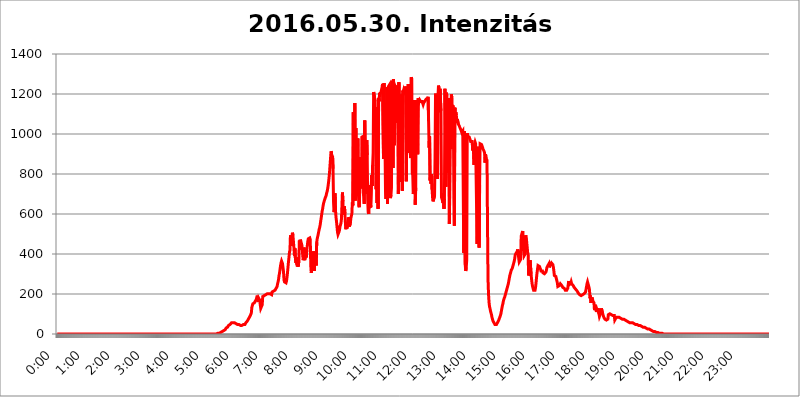
| Category | 2016.05.30. Intenzitás [W/m^2] |
|---|---|
| 0.0 | 0 |
| 0.0006944444444444445 | 0 |
| 0.001388888888888889 | 0 |
| 0.0020833333333333333 | 0 |
| 0.002777777777777778 | 0 |
| 0.003472222222222222 | 0 |
| 0.004166666666666667 | 0 |
| 0.004861111111111111 | 0 |
| 0.005555555555555556 | 0 |
| 0.0062499999999999995 | 0 |
| 0.006944444444444444 | 0 |
| 0.007638888888888889 | 0 |
| 0.008333333333333333 | 0 |
| 0.009027777777777779 | 0 |
| 0.009722222222222222 | 0 |
| 0.010416666666666666 | 0 |
| 0.011111111111111112 | 0 |
| 0.011805555555555555 | 0 |
| 0.012499999999999999 | 0 |
| 0.013194444444444444 | 0 |
| 0.013888888888888888 | 0 |
| 0.014583333333333332 | 0 |
| 0.015277777777777777 | 0 |
| 0.015972222222222224 | 0 |
| 0.016666666666666666 | 0 |
| 0.017361111111111112 | 0 |
| 0.018055555555555557 | 0 |
| 0.01875 | 0 |
| 0.019444444444444445 | 0 |
| 0.02013888888888889 | 0 |
| 0.020833333333333332 | 0 |
| 0.02152777777777778 | 0 |
| 0.022222222222222223 | 0 |
| 0.02291666666666667 | 0 |
| 0.02361111111111111 | 0 |
| 0.024305555555555556 | 0 |
| 0.024999999999999998 | 0 |
| 0.025694444444444447 | 0 |
| 0.02638888888888889 | 0 |
| 0.027083333333333334 | 0 |
| 0.027777777777777776 | 0 |
| 0.02847222222222222 | 0 |
| 0.029166666666666664 | 0 |
| 0.029861111111111113 | 0 |
| 0.030555555555555555 | 0 |
| 0.03125 | 0 |
| 0.03194444444444445 | 0 |
| 0.03263888888888889 | 0 |
| 0.03333333333333333 | 0 |
| 0.034027777777777775 | 0 |
| 0.034722222222222224 | 0 |
| 0.035416666666666666 | 0 |
| 0.036111111111111115 | 0 |
| 0.03680555555555556 | 0 |
| 0.0375 | 0 |
| 0.03819444444444444 | 0 |
| 0.03888888888888889 | 0 |
| 0.03958333333333333 | 0 |
| 0.04027777777777778 | 0 |
| 0.04097222222222222 | 0 |
| 0.041666666666666664 | 0 |
| 0.042361111111111106 | 0 |
| 0.04305555555555556 | 0 |
| 0.043750000000000004 | 0 |
| 0.044444444444444446 | 0 |
| 0.04513888888888889 | 0 |
| 0.04583333333333334 | 0 |
| 0.04652777777777778 | 0 |
| 0.04722222222222222 | 0 |
| 0.04791666666666666 | 0 |
| 0.04861111111111111 | 0 |
| 0.049305555555555554 | 0 |
| 0.049999999999999996 | 0 |
| 0.05069444444444445 | 0 |
| 0.051388888888888894 | 0 |
| 0.052083333333333336 | 0 |
| 0.05277777777777778 | 0 |
| 0.05347222222222222 | 0 |
| 0.05416666666666667 | 0 |
| 0.05486111111111111 | 0 |
| 0.05555555555555555 | 0 |
| 0.05625 | 0 |
| 0.05694444444444444 | 0 |
| 0.057638888888888885 | 0 |
| 0.05833333333333333 | 0 |
| 0.05902777777777778 | 0 |
| 0.059722222222222225 | 0 |
| 0.06041666666666667 | 0 |
| 0.061111111111111116 | 0 |
| 0.06180555555555556 | 0 |
| 0.0625 | 0 |
| 0.06319444444444444 | 0 |
| 0.06388888888888888 | 0 |
| 0.06458333333333334 | 0 |
| 0.06527777777777778 | 0 |
| 0.06597222222222222 | 0 |
| 0.06666666666666667 | 0 |
| 0.06736111111111111 | 0 |
| 0.06805555555555555 | 0 |
| 0.06874999999999999 | 0 |
| 0.06944444444444443 | 0 |
| 0.07013888888888889 | 0 |
| 0.07083333333333333 | 0 |
| 0.07152777777777779 | 0 |
| 0.07222222222222223 | 0 |
| 0.07291666666666667 | 0 |
| 0.07361111111111111 | 0 |
| 0.07430555555555556 | 0 |
| 0.075 | 0 |
| 0.07569444444444444 | 0 |
| 0.0763888888888889 | 0 |
| 0.07708333333333334 | 0 |
| 0.07777777777777778 | 0 |
| 0.07847222222222222 | 0 |
| 0.07916666666666666 | 0 |
| 0.0798611111111111 | 0 |
| 0.08055555555555556 | 0 |
| 0.08125 | 0 |
| 0.08194444444444444 | 0 |
| 0.08263888888888889 | 0 |
| 0.08333333333333333 | 0 |
| 0.08402777777777777 | 0 |
| 0.08472222222222221 | 0 |
| 0.08541666666666665 | 0 |
| 0.08611111111111112 | 0 |
| 0.08680555555555557 | 0 |
| 0.08750000000000001 | 0 |
| 0.08819444444444445 | 0 |
| 0.08888888888888889 | 0 |
| 0.08958333333333333 | 0 |
| 0.09027777777777778 | 0 |
| 0.09097222222222222 | 0 |
| 0.09166666666666667 | 0 |
| 0.09236111111111112 | 0 |
| 0.09305555555555556 | 0 |
| 0.09375 | 0 |
| 0.09444444444444444 | 0 |
| 0.09513888888888888 | 0 |
| 0.09583333333333333 | 0 |
| 0.09652777777777777 | 0 |
| 0.09722222222222222 | 0 |
| 0.09791666666666667 | 0 |
| 0.09861111111111111 | 0 |
| 0.09930555555555555 | 0 |
| 0.09999999999999999 | 0 |
| 0.10069444444444443 | 0 |
| 0.1013888888888889 | 0 |
| 0.10208333333333335 | 0 |
| 0.10277777777777779 | 0 |
| 0.10347222222222223 | 0 |
| 0.10416666666666667 | 0 |
| 0.10486111111111111 | 0 |
| 0.10555555555555556 | 0 |
| 0.10625 | 0 |
| 0.10694444444444444 | 0 |
| 0.1076388888888889 | 0 |
| 0.10833333333333334 | 0 |
| 0.10902777777777778 | 0 |
| 0.10972222222222222 | 0 |
| 0.1111111111111111 | 0 |
| 0.11180555555555556 | 0 |
| 0.11180555555555556 | 0 |
| 0.1125 | 0 |
| 0.11319444444444444 | 0 |
| 0.11388888888888889 | 0 |
| 0.11458333333333333 | 0 |
| 0.11527777777777777 | 0 |
| 0.11597222222222221 | 0 |
| 0.11666666666666665 | 0 |
| 0.1173611111111111 | 0 |
| 0.11805555555555557 | 0 |
| 0.11944444444444445 | 0 |
| 0.12013888888888889 | 0 |
| 0.12083333333333333 | 0 |
| 0.12152777777777778 | 0 |
| 0.12222222222222223 | 0 |
| 0.12291666666666667 | 0 |
| 0.12291666666666667 | 0 |
| 0.12361111111111112 | 0 |
| 0.12430555555555556 | 0 |
| 0.125 | 0 |
| 0.12569444444444444 | 0 |
| 0.12638888888888888 | 0 |
| 0.12708333333333333 | 0 |
| 0.16875 | 0 |
| 0.12847222222222224 | 0 |
| 0.12916666666666668 | 0 |
| 0.12986111111111112 | 0 |
| 0.13055555555555556 | 0 |
| 0.13125 | 0 |
| 0.13194444444444445 | 0 |
| 0.1326388888888889 | 0 |
| 0.13333333333333333 | 0 |
| 0.13402777777777777 | 0 |
| 0.13402777777777777 | 0 |
| 0.13472222222222222 | 0 |
| 0.13541666666666666 | 0 |
| 0.1361111111111111 | 0 |
| 0.13749999999999998 | 0 |
| 0.13819444444444443 | 0 |
| 0.1388888888888889 | 0 |
| 0.13958333333333334 | 0 |
| 0.14027777777777778 | 0 |
| 0.14097222222222222 | 0 |
| 0.14166666666666666 | 0 |
| 0.1423611111111111 | 0 |
| 0.14305555555555557 | 0 |
| 0.14375000000000002 | 0 |
| 0.14444444444444446 | 0 |
| 0.1451388888888889 | 0 |
| 0.1451388888888889 | 0 |
| 0.14652777777777778 | 0 |
| 0.14722222222222223 | 0 |
| 0.14791666666666667 | 0 |
| 0.1486111111111111 | 0 |
| 0.14930555555555555 | 0 |
| 0.15 | 0 |
| 0.15069444444444444 | 0 |
| 0.15138888888888888 | 0 |
| 0.15208333333333332 | 0 |
| 0.15277777777777776 | 0 |
| 0.15347222222222223 | 0 |
| 0.15416666666666667 | 0 |
| 0.15486111111111112 | 0 |
| 0.15555555555555556 | 0 |
| 0.15625 | 0 |
| 0.15694444444444444 | 0 |
| 0.15763888888888888 | 0 |
| 0.15833333333333333 | 0 |
| 0.15902777777777777 | 0 |
| 0.15972222222222224 | 0 |
| 0.16041666666666668 | 0 |
| 0.16111111111111112 | 0 |
| 0.16180555555555556 | 0 |
| 0.1625 | 0 |
| 0.16319444444444445 | 0 |
| 0.1638888888888889 | 0 |
| 0.16458333333333333 | 0 |
| 0.16527777777777777 | 0 |
| 0.16597222222222222 | 0 |
| 0.16666666666666666 | 0 |
| 0.1673611111111111 | 0 |
| 0.16805555555555554 | 0 |
| 0.16874999999999998 | 0 |
| 0.16944444444444443 | 0 |
| 0.17013888888888887 | 0 |
| 0.1708333333333333 | 0 |
| 0.17152777777777775 | 0 |
| 0.17222222222222225 | 0 |
| 0.1729166666666667 | 0 |
| 0.17361111111111113 | 0 |
| 0.17430555555555557 | 0 |
| 0.17500000000000002 | 0 |
| 0.17569444444444446 | 0 |
| 0.1763888888888889 | 0 |
| 0.17708333333333334 | 0 |
| 0.17777777777777778 | 0 |
| 0.17847222222222223 | 0 |
| 0.17916666666666667 | 0 |
| 0.1798611111111111 | 0 |
| 0.18055555555555555 | 0 |
| 0.18125 | 0 |
| 0.18194444444444444 | 0 |
| 0.1826388888888889 | 0 |
| 0.18333333333333335 | 0 |
| 0.1840277777777778 | 0 |
| 0.18472222222222223 | 0 |
| 0.18541666666666667 | 0 |
| 0.18611111111111112 | 0 |
| 0.18680555555555556 | 0 |
| 0.1875 | 0 |
| 0.18819444444444444 | 0 |
| 0.18888888888888888 | 0 |
| 0.18958333333333333 | 0 |
| 0.19027777777777777 | 0 |
| 0.1909722222222222 | 0 |
| 0.19166666666666665 | 0 |
| 0.19236111111111112 | 0 |
| 0.19305555555555554 | 0 |
| 0.19375 | 0 |
| 0.19444444444444445 | 0 |
| 0.1951388888888889 | 0 |
| 0.19583333333333333 | 0 |
| 0.19652777777777777 | 0 |
| 0.19722222222222222 | 0 |
| 0.19791666666666666 | 0 |
| 0.1986111111111111 | 0 |
| 0.19930555555555554 | 0 |
| 0.19999999999999998 | 0 |
| 0.20069444444444443 | 0 |
| 0.20138888888888887 | 0 |
| 0.2020833333333333 | 0 |
| 0.2027777777777778 | 0 |
| 0.2034722222222222 | 0 |
| 0.2041666666666667 | 0 |
| 0.20486111111111113 | 0 |
| 0.20555555555555557 | 0 |
| 0.20625000000000002 | 0 |
| 0.20694444444444446 | 0 |
| 0.2076388888888889 | 0 |
| 0.20833333333333334 | 0 |
| 0.20902777777777778 | 0 |
| 0.20972222222222223 | 0 |
| 0.21041666666666667 | 0 |
| 0.2111111111111111 | 0 |
| 0.21180555555555555 | 0 |
| 0.2125 | 0 |
| 0.21319444444444444 | 0 |
| 0.2138888888888889 | 0 |
| 0.21458333333333335 | 0 |
| 0.2152777777777778 | 0 |
| 0.21597222222222223 | 0 |
| 0.21666666666666667 | 0 |
| 0.21736111111111112 | 0 |
| 0.21805555555555556 | 0 |
| 0.21875 | 0 |
| 0.21944444444444444 | 0 |
| 0.22013888888888888 | 0 |
| 0.22083333333333333 | 0 |
| 0.22152777777777777 | 0 |
| 0.2222222222222222 | 0 |
| 0.22291666666666665 | 0 |
| 0.2236111111111111 | 0 |
| 0.22430555555555556 | 0 |
| 0.225 | 3.525 |
| 0.22569444444444445 | 3.525 |
| 0.2263888888888889 | 3.525 |
| 0.22708333333333333 | 3.525 |
| 0.22777777777777777 | 3.525 |
| 0.22847222222222222 | 7.887 |
| 0.22916666666666666 | 7.887 |
| 0.2298611111111111 | 12.257 |
| 0.23055555555555554 | 12.257 |
| 0.23124999999999998 | 12.257 |
| 0.23194444444444443 | 12.257 |
| 0.23263888888888887 | 12.257 |
| 0.2333333333333333 | 16.636 |
| 0.2340277777777778 | 16.636 |
| 0.2347222222222222 | 21.024 |
| 0.2354166666666667 | 21.024 |
| 0.23611111111111113 | 25.419 |
| 0.23680555555555557 | 29.823 |
| 0.23750000000000002 | 29.823 |
| 0.23819444444444446 | 34.234 |
| 0.2388888888888889 | 34.234 |
| 0.23958333333333334 | 38.653 |
| 0.24027777777777778 | 43.079 |
| 0.24097222222222223 | 43.079 |
| 0.24166666666666667 | 47.511 |
| 0.2423611111111111 | 47.511 |
| 0.24305555555555555 | 51.951 |
| 0.24375 | 51.951 |
| 0.24444444444444446 | 56.398 |
| 0.24513888888888888 | 56.398 |
| 0.24583333333333335 | 56.398 |
| 0.2465277777777778 | 56.398 |
| 0.24722222222222223 | 56.398 |
| 0.24791666666666667 | 56.398 |
| 0.24861111111111112 | 56.398 |
| 0.24930555555555556 | 56.398 |
| 0.25 | 51.951 |
| 0.25069444444444444 | 51.951 |
| 0.2513888888888889 | 51.951 |
| 0.2520833333333333 | 51.951 |
| 0.25277777777777777 | 47.511 |
| 0.2534722222222222 | 47.511 |
| 0.25416666666666665 | 47.511 |
| 0.2548611111111111 | 47.511 |
| 0.2555555555555556 | 47.511 |
| 0.25625000000000003 | 47.511 |
| 0.2569444444444445 | 43.079 |
| 0.2576388888888889 | 43.079 |
| 0.25833333333333336 | 43.079 |
| 0.2590277777777778 | 43.079 |
| 0.25972222222222224 | 43.079 |
| 0.2604166666666667 | 43.079 |
| 0.2611111111111111 | 47.511 |
| 0.26180555555555557 | 47.511 |
| 0.2625 | 47.511 |
| 0.26319444444444445 | 47.511 |
| 0.2638888888888889 | 51.951 |
| 0.26458333333333334 | 56.398 |
| 0.2652777777777778 | 60.85 |
| 0.2659722222222222 | 60.85 |
| 0.26666666666666666 | 65.31 |
| 0.2673611111111111 | 69.775 |
| 0.26805555555555555 | 74.246 |
| 0.26875 | 78.722 |
| 0.26944444444444443 | 83.205 |
| 0.2701388888888889 | 87.692 |
| 0.2708333333333333 | 92.184 |
| 0.27152777777777776 | 96.682 |
| 0.2722222222222222 | 105.69 |
| 0.27291666666666664 | 132.814 |
| 0.2736111111111111 | 128.284 |
| 0.2743055555555555 | 150.964 |
| 0.27499999999999997 | 146.423 |
| 0.27569444444444446 | 155.509 |
| 0.27638888888888885 | 155.509 |
| 0.27708333333333335 | 160.056 |
| 0.2777777777777778 | 164.605 |
| 0.27847222222222223 | 169.156 |
| 0.2791666666666667 | 173.709 |
| 0.2798611111111111 | 182.82 |
| 0.28055555555555556 | 191.937 |
| 0.28125 | 191.937 |
| 0.28194444444444444 | 160.056 |
| 0.2826388888888889 | 178.264 |
| 0.2833333333333333 | 178.264 |
| 0.28402777777777777 | 169.156 |
| 0.2847222222222222 | 146.423 |
| 0.28541666666666665 | 128.284 |
| 0.28611111111111115 | 128.284 |
| 0.28680555555555554 | 132.814 |
| 0.28750000000000003 | 146.423 |
| 0.2881944444444445 | 187.378 |
| 0.2888888888888889 | 187.378 |
| 0.28958333333333336 | 191.937 |
| 0.2902777777777778 | 191.937 |
| 0.29097222222222224 | 196.497 |
| 0.2916666666666667 | 196.497 |
| 0.2923611111111111 | 196.497 |
| 0.29305555555555557 | 201.058 |
| 0.29375 | 201.058 |
| 0.29444444444444445 | 201.058 |
| 0.2951388888888889 | 201.058 |
| 0.29583333333333334 | 201.058 |
| 0.2965277777777778 | 201.058 |
| 0.2972222222222222 | 201.058 |
| 0.29791666666666666 | 201.058 |
| 0.2986111111111111 | 201.058 |
| 0.29930555555555555 | 205.62 |
| 0.3 | 205.62 |
| 0.30069444444444443 | 196.497 |
| 0.3013888888888889 | 210.182 |
| 0.3020833333333333 | 214.746 |
| 0.30277777777777776 | 214.746 |
| 0.3034722222222222 | 214.746 |
| 0.30416666666666664 | 219.309 |
| 0.3048611111111111 | 219.309 |
| 0.3055555555555555 | 219.309 |
| 0.30624999999999997 | 223.873 |
| 0.3069444444444444 | 228.436 |
| 0.3076388888888889 | 233 |
| 0.30833333333333335 | 237.564 |
| 0.3090277777777778 | 251.251 |
| 0.30972222222222223 | 260.373 |
| 0.3104166666666667 | 274.047 |
| 0.3111111111111111 | 292.259 |
| 0.31180555555555556 | 305.898 |
| 0.3125 | 324.052 |
| 0.31319444444444444 | 342.162 |
| 0.3138888888888889 | 355.712 |
| 0.3145833333333333 | 364.728 |
| 0.31527777777777777 | 360.221 |
| 0.3159722222222222 | 351.198 |
| 0.31666666666666665 | 346.682 |
| 0.31736111111111115 | 310.44 |
| 0.31805555555555554 | 269.49 |
| 0.31875000000000003 | 260.373 |
| 0.3194444444444445 | 264.932 |
| 0.3201388888888889 | 255.813 |
| 0.32083333333333336 | 255.813 |
| 0.3215277777777778 | 264.932 |
| 0.32222222222222224 | 283.156 |
| 0.3229166666666667 | 305.898 |
| 0.3236111111111111 | 333.113 |
| 0.32430555555555557 | 360.221 |
| 0.325 | 382.715 |
| 0.32569444444444445 | 409.574 |
| 0.3263888888888889 | 418.492 |
| 0.32708333333333334 | 493.475 |
| 0.3277777777777778 | 462.786 |
| 0.3284722222222222 | 440.702 |
| 0.32916666666666666 | 480.356 |
| 0.3298611111111111 | 506.542 |
| 0.33055555555555555 | 493.475 |
| 0.33125 | 489.108 |
| 0.33194444444444443 | 431.833 |
| 0.3326388888888889 | 391.685 |
| 0.3333333333333333 | 427.39 |
| 0.3340277777777778 | 378.224 |
| 0.3347222222222222 | 355.712 |
| 0.3354166666666667 | 382.715 |
| 0.3361111111111111 | 346.682 |
| 0.3368055555555556 | 337.639 |
| 0.33749999999999997 | 360.221 |
| 0.33819444444444446 | 337.639 |
| 0.33888888888888885 | 373.729 |
| 0.33958333333333335 | 467.187 |
| 0.34027777777777773 | 422.943 |
| 0.34097222222222223 | 471.582 |
| 0.3416666666666666 | 462.786 |
| 0.3423611111111111 | 453.968 |
| 0.3430555555555555 | 445.129 |
| 0.34375 | 440.702 |
| 0.3444444444444445 | 387.202 |
| 0.3451388888888889 | 369.23 |
| 0.3458333333333334 | 431.833 |
| 0.34652777777777777 | 422.943 |
| 0.34722222222222227 | 369.23 |
| 0.34791666666666665 | 414.035 |
| 0.34861111111111115 | 409.574 |
| 0.34930555555555554 | 382.715 |
| 0.35000000000000003 | 422.943 |
| 0.3506944444444444 | 440.702 |
| 0.3513888888888889 | 462.786 |
| 0.3520833333333333 | 475.972 |
| 0.3527777777777778 | 480.356 |
| 0.3534722222222222 | 480.356 |
| 0.3541666666666667 | 480.356 |
| 0.3548611111111111 | 471.582 |
| 0.35555555555555557 | 342.162 |
| 0.35625 | 305.898 |
| 0.35694444444444445 | 301.354 |
| 0.3576388888888889 | 337.639 |
| 0.35833333333333334 | 373.729 |
| 0.3590277777777778 | 382.715 |
| 0.3597222222222222 | 414.035 |
| 0.36041666666666666 | 314.98 |
| 0.3611111111111111 | 310.44 |
| 0.36180555555555555 | 396.164 |
| 0.3625 | 387.202 |
| 0.36319444444444443 | 342.162 |
| 0.3638888888888889 | 458.38 |
| 0.3645833333333333 | 475.972 |
| 0.3652777777777778 | 480.356 |
| 0.3659722222222222 | 497.836 |
| 0.3666666666666667 | 510.885 |
| 0.3673611111111111 | 523.88 |
| 0.3680555555555556 | 532.513 |
| 0.36874999999999997 | 545.416 |
| 0.36944444444444446 | 562.53 |
| 0.37013888888888885 | 579.542 |
| 0.37083333333333335 | 596.45 |
| 0.37152777777777773 | 613.252 |
| 0.37222222222222223 | 625.784 |
| 0.3729166666666666 | 642.4 |
| 0.3736111111111111 | 654.791 |
| 0.3743055555555555 | 663.019 |
| 0.375 | 671.22 |
| 0.3756944444444445 | 679.395 |
| 0.3763888888888889 | 683.473 |
| 0.3770833333333334 | 691.608 |
| 0.37777777777777777 | 703.762 |
| 0.37847222222222227 | 711.832 |
| 0.37916666666666665 | 723.889 |
| 0.37986111111111115 | 739.877 |
| 0.38055555555555554 | 759.723 |
| 0.38125000000000003 | 783.342 |
| 0.3819444444444444 | 810.641 |
| 0.3826388888888889 | 845.365 |
| 0.3833333333333333 | 879.719 |
| 0.3840277777777778 | 913.766 |
| 0.3847222222222222 | 906.223 |
| 0.3854166666666667 | 864.493 |
| 0.3861111111111111 | 891.099 |
| 0.38680555555555557 | 826.123 |
| 0.3875 | 658.909 |
| 0.38819444444444445 | 609.062 |
| 0.3888888888888889 | 625.784 |
| 0.38958333333333334 | 703.762 |
| 0.3902777777777778 | 617.436 |
| 0.3909722222222222 | 583.779 |
| 0.39166666666666666 | 562.53 |
| 0.3923611111111111 | 536.82 |
| 0.39305555555555555 | 510.885 |
| 0.39375 | 497.836 |
| 0.39444444444444443 | 497.836 |
| 0.3951388888888889 | 510.885 |
| 0.3958333333333333 | 519.555 |
| 0.3965277777777778 | 536.82 |
| 0.3972222222222222 | 545.416 |
| 0.3979166666666667 | 553.986 |
| 0.3986111111111111 | 575.299 |
| 0.3993055555555556 | 642.4 |
| 0.39999999999999997 | 707.8 |
| 0.40069444444444446 | 663.019 |
| 0.40138888888888885 | 596.45 |
| 0.40208333333333335 | 596.45 |
| 0.40277777777777773 | 638.256 |
| 0.40347222222222223 | 604.864 |
| 0.4041666666666666 | 553.986 |
| 0.4048611111111111 | 523.88 |
| 0.4055555555555555 | 558.261 |
| 0.40625 | 528.2 |
| 0.4069444444444445 | 545.416 |
| 0.4076388888888889 | 566.793 |
| 0.4083333333333334 | 566.793 |
| 0.40902777777777777 | 583.779 |
| 0.40972222222222227 | 536.82 |
| 0.41041666666666665 | 541.121 |
| 0.41111111111111115 | 553.986 |
| 0.41180555555555554 | 579.542 |
| 0.41250000000000003 | 583.779 |
| 0.4131944444444444 | 600.661 |
| 0.4138888888888889 | 658.909 |
| 0.4145833333333333 | 642.4 |
| 0.4152777777777778 | 1108.816 |
| 0.4159722222222222 | 675.311 |
| 0.4166666666666667 | 787.258 |
| 0.4173611111111111 | 1154.814 |
| 0.41805555555555557 | 667.123 |
| 0.41875 | 1029.798 |
| 0.41944444444444445 | 723.889 |
| 0.4201388888888889 | 735.89 |
| 0.42083333333333334 | 695.666 |
| 0.4215277777777778 | 977.508 |
| 0.4222222222222222 | 731.896 |
| 0.42291666666666666 | 642.4 |
| 0.4236111111111111 | 634.105 |
| 0.42430555555555555 | 731.896 |
| 0.425 | 883.516 |
| 0.42569444444444443 | 759.723 |
| 0.4263888888888889 | 751.803 |
| 0.4270833333333333 | 727.896 |
| 0.4277777777777778 | 988.714 |
| 0.4284722222222222 | 759.723 |
| 0.4291666666666667 | 992.448 |
| 0.4298611111111111 | 691.608 |
| 0.4305555555555556 | 650.667 |
| 0.43124999999999997 | 1067.267 |
| 0.43194444444444446 | 891.099 |
| 0.43263888888888885 | 767.62 |
| 0.43333333333333335 | 699.717 |
| 0.43402777777777773 | 970.034 |
| 0.43472222222222223 | 894.885 |
| 0.4354166666666666 | 671.22 |
| 0.4361111111111111 | 609.062 |
| 0.4368055555555555 | 600.661 |
| 0.4375 | 667.123 |
| 0.4381944444444445 | 629.948 |
| 0.4388888888888889 | 743.859 |
| 0.4395833333333334 | 634.105 |
| 0.44027777777777777 | 638.256 |
| 0.44097222222222227 | 795.074 |
| 0.44166666666666665 | 739.877 |
| 0.44236111111111115 | 845.365 |
| 0.44305555555555554 | 906.223 |
| 0.44375000000000003 | 1209.807 |
| 0.4444444444444444 | 1205.82 |
| 0.4451388888888889 | 1209.807 |
| 0.4458333333333333 | 1162.571 |
| 0.4465277777777778 | 970.034 |
| 0.4472222222222222 | 723.889 |
| 0.4479166666666667 | 906.223 |
| 0.4486111111111111 | 654.791 |
| 0.44930555555555557 | 1135.543 |
| 0.45 | 625.784 |
| 0.45069444444444445 | 1178.177 |
| 0.4513888888888889 | 1162.571 |
| 0.45208333333333334 | 1201.843 |
| 0.4527777777777778 | 1201.843 |
| 0.4534722222222222 | 1201.843 |
| 0.45416666666666666 | 1209.807 |
| 0.4548611111111111 | 1213.804 |
| 0.45555555555555555 | 1233.951 |
| 0.45625 | 1250.275 |
| 0.45694444444444443 | 1254.387 |
| 0.4576388888888889 | 875.918 |
| 0.4583333333333333 | 1254.387 |
| 0.4590277777777778 | 1108.816 |
| 0.4597222222222222 | 932.576 |
| 0.4604166666666667 | 711.832 |
| 0.4611111111111111 | 675.311 |
| 0.4618055555555556 | 1067.267 |
| 0.46249999999999997 | 1233.951 |
| 0.46319444444444446 | 650.667 |
| 0.46388888888888885 | 1229.899 |
| 0.46458333333333335 | 1238.014 |
| 0.46527777777777773 | 1233.951 |
| 0.46597222222222223 | 1246.176 |
| 0.4666666666666666 | 1242.089 |
| 0.4673611111111111 | 679.395 |
| 0.4680555555555555 | 695.666 |
| 0.46875 | 731.896 |
| 0.4694444444444445 | 1229.899 |
| 0.4701388888888889 | 1266.8 |
| 0.4708333333333334 | 829.981 |
| 0.47152777777777777 | 1275.142 |
| 0.47222222222222227 | 1229.899 |
| 0.47291666666666665 | 943.832 |
| 0.47361111111111115 | 1242.089 |
| 0.47430555555555554 | 1246.176 |
| 0.47500000000000003 | 1242.089 |
| 0.4756944444444444 | 1229.899 |
| 0.4763888888888889 | 1056.004 |
| 0.4770833333333333 | 1059.756 |
| 0.4777777777777778 | 1242.089 |
| 0.4784722222222222 | 699.717 |
| 0.4791666666666667 | 1258.511 |
| 0.4798611111111111 | 868.305 |
| 0.48055555555555557 | 759.723 |
| 0.48125 | 981.244 |
| 0.48194444444444445 | 1147.086 |
| 0.4826388888888889 | 1131.708 |
| 0.48333333333333334 | 1197.876 |
| 0.4840277777777778 | 715.858 |
| 0.4847222222222222 | 1217.812 |
| 0.48541666666666666 | 1209.807 |
| 0.4861111111111111 | 1221.83 |
| 0.48680555555555555 | 1217.812 |
| 0.4875 | 1209.807 |
| 0.48819444444444443 | 1217.812 |
| 0.4888888888888889 | 1238.014 |
| 0.4895833333333333 | 763.674 |
| 0.4902777777777778 | 1089.873 |
| 0.4909722222222222 | 1233.951 |
| 0.4916666666666667 | 906.223 |
| 0.4923611111111111 | 1250.275 |
| 0.4930555555555556 | 932.576 |
| 0.49374999999999997 | 1250.275 |
| 0.49444444444444446 | 1063.51 |
| 0.49513888888888885 | 902.447 |
| 0.49583333333333335 | 879.719 |
| 0.49652777777777773 | 1283.541 |
| 0.49722222222222223 | 1275.142 |
| 0.4979166666666666 | 802.868 |
| 0.4986111111111111 | 795.074 |
| 0.4993055555555555 | 699.717 |
| 0.5 | 711.832 |
| 0.5006944444444444 | 1170.358 |
| 0.5013888888888889 | 951.327 |
| 0.5020833333333333 | 646.537 |
| 0.5027777777777778 | 731.896 |
| 0.5034722222222222 | 1170.358 |
| 0.5041666666666667 | 932.576 |
| 0.5048611111111111 | 1147.086 |
| 0.5055555555555555 | 898.668 |
| 0.50625 | 1178.177 |
| 0.5069444444444444 | 1174.263 |
| 0.5076388888888889 | 1162.571 |
| 0.5083333333333333 | 1170.358 |
| 0.5090277777777777 | 1166.46 |
| 0.5097222222222222 | 1162.571 |
| 0.5104166666666666 | 1162.571 |
| 0.5111111111111112 | 1162.571 |
| 0.5118055555555555 | 1162.571 |
| 0.5125000000000001 | 1154.814 |
| 0.5131944444444444 | 1147.086 |
| 0.513888888888889 | 1154.814 |
| 0.5145833333333333 | 1154.814 |
| 0.5152777777777778 | 1154.814 |
| 0.5159722222222222 | 1166.46 |
| 0.5166666666666667 | 1170.358 |
| 0.517361111111111 | 1174.263 |
| 0.5180555555555556 | 1170.358 |
| 0.5187499999999999 | 1174.263 |
| 0.5194444444444445 | 1178.177 |
| 0.5201388888888888 | 1186.03 |
| 0.5208333333333334 | 1063.51 |
| 0.5215277777777778 | 932.576 |
| 0.5222222222222223 | 988.714 |
| 0.5229166666666667 | 767.62 |
| 0.5236111111111111 | 795.074 |
| 0.5243055555555556 | 751.803 |
| 0.525 | 798.974 |
| 0.5256944444444445 | 723.889 |
| 0.5263888888888889 | 683.473 |
| 0.5270833333333333 | 663.019 |
| 0.5277777777777778 | 663.019 |
| 0.5284722222222222 | 667.123 |
| 0.5291666666666667 | 691.608 |
| 0.5298611111111111 | 875.918 |
| 0.5305555555555556 | 1201.843 |
| 0.53125 | 962.555 |
| 0.5319444444444444 | 1108.816 |
| 0.5326388888888889 | 860.676 |
| 0.5333333333333333 | 775.492 |
| 0.5340277777777778 | 1189.969 |
| 0.5347222222222222 | 1242.089 |
| 0.5354166666666667 | 1229.899 |
| 0.5361111111111111 | 1108.816 |
| 0.5368055555555555 | 1225.859 |
| 0.5375 | 1229.899 |
| 0.5381944444444444 | 1116.426 |
| 0.5388888888888889 | 683.473 |
| 0.5395833333333333 | 687.544 |
| 0.5402777777777777 | 667.123 |
| 0.5409722222222222 | 654.791 |
| 0.5416666666666666 | 703.762 |
| 0.5423611111111112 | 625.784 |
| 0.5430555555555555 | 675.311 |
| 0.5437500000000001 | 1225.859 |
| 0.5444444444444444 | 1041.019 |
| 0.545138888888889 | 735.89 |
| 0.5458333333333333 | 1205.82 |
| 0.5465277777777778 | 1189.969 |
| 0.5472222222222222 | 806.757 |
| 0.5479166666666667 | 1105.019 |
| 0.548611111111111 | 1059.756 |
| 0.5493055555555556 | 1178.177 |
| 0.5499999999999999 | 549.704 |
| 0.5506944444444445 | 545.416 |
| 0.5513888888888888 | 1178.177 |
| 0.5520833333333334 | 925.06 |
| 0.5527777777777778 | 1197.876 |
| 0.5534722222222223 | 1182.099 |
| 0.5541666666666667 | 1116.426 |
| 0.5548611111111111 | 1143.232 |
| 0.5555555555555556 | 1112.618 |
| 0.55625 | 695.666 |
| 0.5569444444444445 | 541.121 |
| 0.5576388888888889 | 1131.708 |
| 0.5583333333333333 | 1093.653 |
| 0.5590277777777778 | 1108.816 |
| 0.5597222222222222 | 1093.653 |
| 0.5604166666666667 | 1056.004 |
| 0.5611111111111111 | 1074.789 |
| 0.5618055555555556 | 1071.027 |
| 0.5625 | 1048.508 |
| 0.5631944444444444 | 1052.255 |
| 0.5638888888888889 | 1041.019 |
| 0.5645833333333333 | 1033.537 |
| 0.5652777777777778 | 1029.798 |
| 0.5659722222222222 | 1022.323 |
| 0.5666666666666667 | 1014.852 |
| 0.5673611111111111 | 1007.383 |
| 0.5680555555555555 | 1007.383 |
| 0.56875 | 1014.852 |
| 0.5694444444444444 | 1018.587 |
| 0.5701388888888889 | 405.108 |
| 0.5708333333333333 | 1014.852 |
| 0.5715277777777777 | 1014.852 |
| 0.5722222222222222 | 346.682 |
| 0.5729166666666666 | 314.98 |
| 0.5736111111111112 | 333.113 |
| 0.5743055555555555 | 369.23 |
| 0.5750000000000001 | 1003.65 |
| 0.5756944444444444 | 988.714 |
| 0.576388888888889 | 992.448 |
| 0.5770833333333333 | 988.714 |
| 0.5777777777777778 | 984.98 |
| 0.5784722222222222 | 977.508 |
| 0.5791666666666667 | 970.034 |
| 0.579861111111111 | 962.555 |
| 0.5805555555555556 | 958.814 |
| 0.5812499999999999 | 958.814 |
| 0.5819444444444445 | 962.555 |
| 0.5826388888888888 | 917.534 |
| 0.5833333333333334 | 951.327 |
| 0.5840277777777778 | 955.071 |
| 0.5847222222222223 | 845.365 |
| 0.5854166666666667 | 947.58 |
| 0.5861111111111111 | 958.814 |
| 0.5868055555555556 | 951.327 |
| 0.5875 | 955.071 |
| 0.5881944444444445 | 947.58 |
| 0.5888888888888889 | 449.551 |
| 0.5895833333333333 | 936.33 |
| 0.5902777777777778 | 932.576 |
| 0.5909722222222222 | 818.392 |
| 0.5916666666666667 | 431.833 |
| 0.5923611111111111 | 743.859 |
| 0.5930555555555556 | 951.327 |
| 0.59375 | 955.071 |
| 0.5944444444444444 | 947.58 |
| 0.5951388888888889 | 947.58 |
| 0.5958333333333333 | 947.58 |
| 0.5965277777777778 | 932.576 |
| 0.5972222222222222 | 925.06 |
| 0.5979166666666667 | 921.298 |
| 0.5986111111111111 | 913.766 |
| 0.5993055555555555 | 906.223 |
| 0.6 | 856.855 |
| 0.6006944444444444 | 898.668 |
| 0.6013888888888889 | 879.719 |
| 0.6020833333333333 | 875.918 |
| 0.6027777777777777 | 868.305 |
| 0.6034722222222222 | 541.121 |
| 0.6041666666666666 | 274.047 |
| 0.6048611111111112 | 201.058 |
| 0.6055555555555555 | 160.056 |
| 0.6062500000000001 | 137.347 |
| 0.6069444444444444 | 128.284 |
| 0.607638888888889 | 114.716 |
| 0.6083333333333333 | 105.69 |
| 0.6090277777777778 | 96.682 |
| 0.6097222222222222 | 83.205 |
| 0.6104166666666667 | 74.246 |
| 0.611111111111111 | 65.31 |
| 0.6118055555555556 | 60.85 |
| 0.6124999999999999 | 56.398 |
| 0.6131944444444445 | 51.951 |
| 0.6138888888888888 | 47.511 |
| 0.6145833333333334 | 47.511 |
| 0.6152777777777778 | 43.079 |
| 0.6159722222222223 | 47.511 |
| 0.6166666666666667 | 51.951 |
| 0.6173611111111111 | 56.398 |
| 0.6180555555555556 | 56.398 |
| 0.61875 | 65.31 |
| 0.6194444444444445 | 69.775 |
| 0.6201388888888889 | 78.722 |
| 0.6208333333333333 | 83.205 |
| 0.6215277777777778 | 92.184 |
| 0.6222222222222222 | 101.184 |
| 0.6229166666666667 | 114.716 |
| 0.6236111111111111 | 128.284 |
| 0.6243055555555556 | 141.884 |
| 0.625 | 150.964 |
| 0.6256944444444444 | 164.605 |
| 0.6263888888888889 | 173.709 |
| 0.6270833333333333 | 178.264 |
| 0.6277777777777778 | 187.378 |
| 0.6284722222222222 | 196.497 |
| 0.6291666666666667 | 205.62 |
| 0.6298611111111111 | 214.746 |
| 0.6305555555555555 | 223.873 |
| 0.63125 | 233 |
| 0.6319444444444444 | 242.127 |
| 0.6326388888888889 | 251.251 |
| 0.6333333333333333 | 264.932 |
| 0.6340277777777777 | 278.603 |
| 0.6347222222222222 | 292.259 |
| 0.6354166666666666 | 301.354 |
| 0.6361111111111112 | 310.44 |
| 0.6368055555555555 | 319.517 |
| 0.6375000000000001 | 324.052 |
| 0.6381944444444444 | 328.584 |
| 0.638888888888889 | 337.639 |
| 0.6395833333333333 | 346.682 |
| 0.6402777777777778 | 355.712 |
| 0.6409722222222222 | 364.728 |
| 0.6416666666666667 | 378.224 |
| 0.642361111111111 | 396.164 |
| 0.6430555555555556 | 400.638 |
| 0.6437499999999999 | 405.108 |
| 0.6444444444444445 | 405.108 |
| 0.6451388888888888 | 414.035 |
| 0.6458333333333334 | 422.943 |
| 0.6465277777777778 | 405.108 |
| 0.6472222222222223 | 378.224 |
| 0.6479166666666667 | 360.221 |
| 0.6486111111111111 | 364.728 |
| 0.6493055555555556 | 355.712 |
| 0.65 | 373.729 |
| 0.6506944444444445 | 489.108 |
| 0.6513888888888889 | 493.475 |
| 0.6520833333333333 | 506.542 |
| 0.6527777777777778 | 515.223 |
| 0.6534722222222222 | 422.943 |
| 0.6541666666666667 | 414.035 |
| 0.6548611111111111 | 391.685 |
| 0.6555555555555556 | 387.202 |
| 0.65625 | 400.638 |
| 0.6569444444444444 | 493.475 |
| 0.6576388888888889 | 489.108 |
| 0.6583333333333333 | 462.786 |
| 0.6590277777777778 | 436.27 |
| 0.6597222222222222 | 409.574 |
| 0.6604166666666667 | 396.164 |
| 0.6611111111111111 | 292.259 |
| 0.6618055555555555 | 296.808 |
| 0.6625 | 314.98 |
| 0.6631944444444444 | 369.23 |
| 0.6638888888888889 | 369.23 |
| 0.6645833333333333 | 296.808 |
| 0.6652777777777777 | 274.047 |
| 0.6659722222222222 | 251.251 |
| 0.6666666666666666 | 237.564 |
| 0.6673611111111111 | 228.436 |
| 0.6680555555555556 | 219.309 |
| 0.6687500000000001 | 214.746 |
| 0.6694444444444444 | 214.746 |
| 0.6701388888888888 | 219.309 |
| 0.6708333333333334 | 233 |
| 0.6715277777777778 | 255.813 |
| 0.6722222222222222 | 283.156 |
| 0.6729166666666666 | 305.898 |
| 0.6736111111111112 | 324.052 |
| 0.6743055555555556 | 342.162 |
| 0.6749999999999999 | 342.162 |
| 0.6756944444444444 | 342.162 |
| 0.6763888888888889 | 337.639 |
| 0.6770833333333334 | 333.113 |
| 0.6777777777777777 | 324.052 |
| 0.6784722222222223 | 314.98 |
| 0.6791666666666667 | 314.98 |
| 0.6798611111111111 | 314.98 |
| 0.6805555555555555 | 314.98 |
| 0.68125 | 305.898 |
| 0.6819444444444445 | 301.354 |
| 0.6826388888888889 | 301.354 |
| 0.6833333333333332 | 301.354 |
| 0.6840277777777778 | 301.354 |
| 0.6847222222222222 | 305.898 |
| 0.6854166666666667 | 310.44 |
| 0.686111111111111 | 319.517 |
| 0.6868055555555556 | 333.113 |
| 0.6875 | 337.639 |
| 0.6881944444444444 | 342.162 |
| 0.688888888888889 | 346.682 |
| 0.6895833333333333 | 351.198 |
| 0.6902777777777778 | 333.113 |
| 0.6909722222222222 | 342.162 |
| 0.6916666666666668 | 346.682 |
| 0.6923611111111111 | 346.682 |
| 0.6930555555555555 | 355.712 |
| 0.69375 | 355.712 |
| 0.6944444444444445 | 355.712 |
| 0.6951388888888889 | 346.682 |
| 0.6958333333333333 | 333.113 |
| 0.6965277777777777 | 314.98 |
| 0.6972222222222223 | 292.259 |
| 0.6979166666666666 | 287.709 |
| 0.6986111111111111 | 287.709 |
| 0.6993055555555556 | 287.709 |
| 0.7000000000000001 | 292.259 |
| 0.7006944444444444 | 287.709 |
| 0.7013888888888888 | 255.813 |
| 0.7020833333333334 | 237.564 |
| 0.7027777777777778 | 233 |
| 0.7034722222222222 | 237.564 |
| 0.7041666666666666 | 242.127 |
| 0.7048611111111112 | 246.689 |
| 0.7055555555555556 | 251.251 |
| 0.7062499999999999 | 251.251 |
| 0.7069444444444444 | 246.689 |
| 0.7076388888888889 | 242.127 |
| 0.7083333333333334 | 237.564 |
| 0.7090277777777777 | 233 |
| 0.7097222222222223 | 233 |
| 0.7104166666666667 | 228.436 |
| 0.7111111111111111 | 228.436 |
| 0.7118055555555555 | 223.873 |
| 0.7125 | 219.309 |
| 0.7131944444444445 | 219.309 |
| 0.7138888888888889 | 219.309 |
| 0.7145833333333332 | 219.309 |
| 0.7152777777777778 | 223.873 |
| 0.7159722222222222 | 228.436 |
| 0.7166666666666667 | 233 |
| 0.717361111111111 | 264.932 |
| 0.7180555555555556 | 246.689 |
| 0.71875 | 251.251 |
| 0.7194444444444444 | 246.689 |
| 0.720138888888889 | 251.251 |
| 0.7208333333333333 | 260.373 |
| 0.7215277777777778 | 251.251 |
| 0.7222222222222222 | 251.251 |
| 0.7229166666666668 | 246.689 |
| 0.7236111111111111 | 242.127 |
| 0.7243055555555555 | 237.564 |
| 0.725 | 233 |
| 0.7256944444444445 | 233 |
| 0.7263888888888889 | 228.436 |
| 0.7270833333333333 | 223.873 |
| 0.7277777777777777 | 223.873 |
| 0.7284722222222223 | 219.309 |
| 0.7291666666666666 | 214.746 |
| 0.7298611111111111 | 210.182 |
| 0.7305555555555556 | 205.62 |
| 0.7312500000000001 | 201.058 |
| 0.7319444444444444 | 201.058 |
| 0.7326388888888888 | 196.497 |
| 0.7333333333333334 | 191.937 |
| 0.7340277777777778 | 191.937 |
| 0.7347222222222222 | 191.937 |
| 0.7354166666666666 | 191.937 |
| 0.7361111111111112 | 196.497 |
| 0.7368055555555556 | 196.497 |
| 0.7374999999999999 | 196.497 |
| 0.7381944444444444 | 201.058 |
| 0.7388888888888889 | 201.058 |
| 0.7395833333333334 | 205.62 |
| 0.7402777777777777 | 205.62 |
| 0.7409722222222223 | 210.182 |
| 0.7416666666666667 | 210.182 |
| 0.7423611111111111 | 210.182 |
| 0.7430555555555555 | 251.251 |
| 0.74375 | 260.373 |
| 0.7444444444444445 | 255.813 |
| 0.7451388888888889 | 242.127 |
| 0.7458333333333332 | 233 |
| 0.7465277777777778 | 219.309 |
| 0.7472222222222222 | 178.264 |
| 0.7479166666666667 | 191.937 |
| 0.748611111111111 | 155.509 |
| 0.7493055555555556 | 169.156 |
| 0.75 | 182.82 |
| 0.7506944444444444 | 173.709 |
| 0.751388888888889 | 164.605 |
| 0.7520833333333333 | 164.605 |
| 0.7527777777777778 | 155.509 |
| 0.7534722222222222 | 119.235 |
| 0.7541666666666668 | 146.423 |
| 0.7548611111111111 | 146.423 |
| 0.7555555555555555 | 123.758 |
| 0.75625 | 110.201 |
| 0.7569444444444445 | 119.235 |
| 0.7576388888888889 | 110.201 |
| 0.7583333333333333 | 128.284 |
| 0.7590277777777777 | 128.284 |
| 0.7597222222222223 | 101.184 |
| 0.7604166666666666 | 87.692 |
| 0.7611111111111111 | 92.184 |
| 0.7618055555555556 | 101.184 |
| 0.7625000000000001 | 105.69 |
| 0.7631944444444444 | 128.284 |
| 0.7638888888888888 | 123.758 |
| 0.7645833333333334 | 128.284 |
| 0.7652777777777778 | 96.682 |
| 0.7659722222222222 | 92.184 |
| 0.7666666666666666 | 83.205 |
| 0.7673611111111112 | 78.722 |
| 0.7680555555555556 | 74.246 |
| 0.7687499999999999 | 69.775 |
| 0.7694444444444444 | 69.775 |
| 0.7701388888888889 | 69.775 |
| 0.7708333333333334 | 69.775 |
| 0.7715277777777777 | 69.775 |
| 0.7722222222222223 | 74.246 |
| 0.7729166666666667 | 96.682 |
| 0.7736111111111111 | 101.184 |
| 0.7743055555555555 | 101.184 |
| 0.775 | 101.184 |
| 0.7756944444444445 | 96.682 |
| 0.7763888888888889 | 96.682 |
| 0.7770833333333332 | 96.682 |
| 0.7777777777777778 | 96.682 |
| 0.7784722222222222 | 96.682 |
| 0.7791666666666667 | 92.184 |
| 0.779861111111111 | 92.184 |
| 0.7805555555555556 | 92.184 |
| 0.78125 | 92.184 |
| 0.7819444444444444 | 69.775 |
| 0.782638888888889 | 65.31 |
| 0.7833333333333333 | 65.31 |
| 0.7840277777777778 | 83.205 |
| 0.7847222222222222 | 83.205 |
| 0.7854166666666668 | 83.205 |
| 0.7861111111111111 | 83.205 |
| 0.7868055555555555 | 83.205 |
| 0.7875 | 83.205 |
| 0.7881944444444445 | 83.205 |
| 0.7888888888888889 | 78.722 |
| 0.7895833333333333 | 78.722 |
| 0.7902777777777777 | 78.722 |
| 0.7909722222222223 | 78.722 |
| 0.7916666666666666 | 74.246 |
| 0.7923611111111111 | 74.246 |
| 0.7930555555555556 | 74.246 |
| 0.7937500000000001 | 74.246 |
| 0.7944444444444444 | 74.246 |
| 0.7951388888888888 | 69.775 |
| 0.7958333333333334 | 69.775 |
| 0.7965277777777778 | 69.775 |
| 0.7972222222222222 | 65.31 |
| 0.7979166666666666 | 65.31 |
| 0.7986111111111112 | 65.31 |
| 0.7993055555555556 | 65.31 |
| 0.7999999999999999 | 65.31 |
| 0.8006944444444444 | 60.85 |
| 0.8013888888888889 | 60.85 |
| 0.8020833333333334 | 60.85 |
| 0.8027777777777777 | 56.398 |
| 0.8034722222222223 | 56.398 |
| 0.8041666666666667 | 56.398 |
| 0.8048611111111111 | 56.398 |
| 0.8055555555555555 | 56.398 |
| 0.80625 | 56.398 |
| 0.8069444444444445 | 56.398 |
| 0.8076388888888889 | 51.951 |
| 0.8083333333333332 | 51.951 |
| 0.8090277777777778 | 51.951 |
| 0.8097222222222222 | 51.951 |
| 0.8104166666666667 | 47.511 |
| 0.811111111111111 | 47.511 |
| 0.8118055555555556 | 47.511 |
| 0.8125 | 47.511 |
| 0.8131944444444444 | 47.511 |
| 0.813888888888889 | 47.511 |
| 0.8145833333333333 | 47.511 |
| 0.8152777777777778 | 43.079 |
| 0.8159722222222222 | 43.079 |
| 0.8166666666666668 | 43.079 |
| 0.8173611111111111 | 43.079 |
| 0.8180555555555555 | 38.653 |
| 0.81875 | 38.653 |
| 0.8194444444444445 | 38.653 |
| 0.8201388888888889 | 38.653 |
| 0.8208333333333333 | 38.653 |
| 0.8215277777777777 | 34.234 |
| 0.8222222222222223 | 34.234 |
| 0.8229166666666666 | 34.234 |
| 0.8236111111111111 | 34.234 |
| 0.8243055555555556 | 29.823 |
| 0.8250000000000001 | 29.823 |
| 0.8256944444444444 | 29.823 |
| 0.8263888888888888 | 29.823 |
| 0.8270833333333334 | 29.823 |
| 0.8277777777777778 | 25.419 |
| 0.8284722222222222 | 25.419 |
| 0.8291666666666666 | 25.419 |
| 0.8298611111111112 | 25.419 |
| 0.8305555555555556 | 21.024 |
| 0.8312499999999999 | 21.024 |
| 0.8319444444444444 | 21.024 |
| 0.8326388888888889 | 21.024 |
| 0.8333333333333334 | 21.024 |
| 0.8340277777777777 | 16.636 |
| 0.8347222222222223 | 16.636 |
| 0.8354166666666667 | 16.636 |
| 0.8361111111111111 | 12.257 |
| 0.8368055555555555 | 12.257 |
| 0.8375 | 12.257 |
| 0.8381944444444445 | 12.257 |
| 0.8388888888888889 | 12.257 |
| 0.8395833333333332 | 12.257 |
| 0.8402777777777778 | 7.887 |
| 0.8409722222222222 | 7.887 |
| 0.8416666666666667 | 7.887 |
| 0.842361111111111 | 7.887 |
| 0.8430555555555556 | 7.887 |
| 0.84375 | 3.525 |
| 0.8444444444444444 | 3.525 |
| 0.845138888888889 | 3.525 |
| 0.8458333333333333 | 3.525 |
| 0.8465277777777778 | 3.525 |
| 0.8472222222222222 | 3.525 |
| 0.8479166666666668 | 3.525 |
| 0.8486111111111111 | 3.525 |
| 0.8493055555555555 | 3.525 |
| 0.85 | 0 |
| 0.8506944444444445 | 0 |
| 0.8513888888888889 | 0 |
| 0.8520833333333333 | 0 |
| 0.8527777777777777 | 0 |
| 0.8534722222222223 | 0 |
| 0.8541666666666666 | 0 |
| 0.8548611111111111 | 0 |
| 0.8555555555555556 | 0 |
| 0.8562500000000001 | 0 |
| 0.8569444444444444 | 0 |
| 0.8576388888888888 | 0 |
| 0.8583333333333334 | 0 |
| 0.8590277777777778 | 0 |
| 0.8597222222222222 | 0 |
| 0.8604166666666666 | 0 |
| 0.8611111111111112 | 0 |
| 0.8618055555555556 | 0 |
| 0.8624999999999999 | 0 |
| 0.8631944444444444 | 0 |
| 0.8638888888888889 | 0 |
| 0.8645833333333334 | 0 |
| 0.8652777777777777 | 0 |
| 0.8659722222222223 | 0 |
| 0.8666666666666667 | 0 |
| 0.8673611111111111 | 0 |
| 0.8680555555555555 | 0 |
| 0.86875 | 0 |
| 0.8694444444444445 | 0 |
| 0.8701388888888889 | 0 |
| 0.8708333333333332 | 0 |
| 0.8715277777777778 | 0 |
| 0.8722222222222222 | 0 |
| 0.8729166666666667 | 0 |
| 0.873611111111111 | 0 |
| 0.8743055555555556 | 0 |
| 0.875 | 0 |
| 0.8756944444444444 | 0 |
| 0.876388888888889 | 0 |
| 0.8770833333333333 | 0 |
| 0.8777777777777778 | 0 |
| 0.8784722222222222 | 0 |
| 0.8791666666666668 | 0 |
| 0.8798611111111111 | 0 |
| 0.8805555555555555 | 0 |
| 0.88125 | 0 |
| 0.8819444444444445 | 0 |
| 0.8826388888888889 | 0 |
| 0.8833333333333333 | 0 |
| 0.8840277777777777 | 0 |
| 0.8847222222222223 | 0 |
| 0.8854166666666666 | 0 |
| 0.8861111111111111 | 0 |
| 0.8868055555555556 | 0 |
| 0.8875000000000001 | 0 |
| 0.8881944444444444 | 0 |
| 0.8888888888888888 | 0 |
| 0.8895833333333334 | 0 |
| 0.8902777777777778 | 0 |
| 0.8909722222222222 | 0 |
| 0.8916666666666666 | 0 |
| 0.8923611111111112 | 0 |
| 0.8930555555555556 | 0 |
| 0.8937499999999999 | 0 |
| 0.8944444444444444 | 0 |
| 0.8951388888888889 | 0 |
| 0.8958333333333334 | 0 |
| 0.8965277777777777 | 0 |
| 0.8972222222222223 | 0 |
| 0.8979166666666667 | 0 |
| 0.8986111111111111 | 0 |
| 0.8993055555555555 | 0 |
| 0.9 | 0 |
| 0.9006944444444445 | 0 |
| 0.9013888888888889 | 0 |
| 0.9020833333333332 | 0 |
| 0.9027777777777778 | 0 |
| 0.9034722222222222 | 0 |
| 0.9041666666666667 | 0 |
| 0.904861111111111 | 0 |
| 0.9055555555555556 | 0 |
| 0.90625 | 0 |
| 0.9069444444444444 | 0 |
| 0.907638888888889 | 0 |
| 0.9083333333333333 | 0 |
| 0.9090277777777778 | 0 |
| 0.9097222222222222 | 0 |
| 0.9104166666666668 | 0 |
| 0.9111111111111111 | 0 |
| 0.9118055555555555 | 0 |
| 0.9125 | 0 |
| 0.9131944444444445 | 0 |
| 0.9138888888888889 | 0 |
| 0.9145833333333333 | 0 |
| 0.9152777777777777 | 0 |
| 0.9159722222222223 | 0 |
| 0.9166666666666666 | 0 |
| 0.9173611111111111 | 0 |
| 0.9180555555555556 | 0 |
| 0.9187500000000001 | 0 |
| 0.9194444444444444 | 0 |
| 0.9201388888888888 | 0 |
| 0.9208333333333334 | 0 |
| 0.9215277777777778 | 0 |
| 0.9222222222222222 | 0 |
| 0.9229166666666666 | 0 |
| 0.9236111111111112 | 0 |
| 0.9243055555555556 | 0 |
| 0.9249999999999999 | 0 |
| 0.9256944444444444 | 0 |
| 0.9263888888888889 | 0 |
| 0.9270833333333334 | 0 |
| 0.9277777777777777 | 0 |
| 0.9284722222222223 | 0 |
| 0.9291666666666667 | 0 |
| 0.9298611111111111 | 0 |
| 0.9305555555555555 | 0 |
| 0.93125 | 0 |
| 0.9319444444444445 | 0 |
| 0.9326388888888889 | 0 |
| 0.9333333333333332 | 0 |
| 0.9340277777777778 | 0 |
| 0.9347222222222222 | 0 |
| 0.9354166666666667 | 0 |
| 0.936111111111111 | 0 |
| 0.9368055555555556 | 0 |
| 0.9375 | 0 |
| 0.9381944444444444 | 0 |
| 0.938888888888889 | 0 |
| 0.9395833333333333 | 0 |
| 0.9402777777777778 | 0 |
| 0.9409722222222222 | 0 |
| 0.9416666666666668 | 0 |
| 0.9423611111111111 | 0 |
| 0.9430555555555555 | 0 |
| 0.94375 | 0 |
| 0.9444444444444445 | 0 |
| 0.9451388888888889 | 0 |
| 0.9458333333333333 | 0 |
| 0.9465277777777777 | 0 |
| 0.9472222222222223 | 0 |
| 0.9479166666666666 | 0 |
| 0.9486111111111111 | 0 |
| 0.9493055555555556 | 0 |
| 0.9500000000000001 | 0 |
| 0.9506944444444444 | 0 |
| 0.9513888888888888 | 0 |
| 0.9520833333333334 | 0 |
| 0.9527777777777778 | 0 |
| 0.9534722222222222 | 0 |
| 0.9541666666666666 | 0 |
| 0.9548611111111112 | 0 |
| 0.9555555555555556 | 0 |
| 0.9562499999999999 | 0 |
| 0.9569444444444444 | 0 |
| 0.9576388888888889 | 0 |
| 0.9583333333333334 | 0 |
| 0.9590277777777777 | 0 |
| 0.9597222222222223 | 0 |
| 0.9604166666666667 | 0 |
| 0.9611111111111111 | 0 |
| 0.9618055555555555 | 0 |
| 0.9625 | 0 |
| 0.9631944444444445 | 0 |
| 0.9638888888888889 | 0 |
| 0.9645833333333332 | 0 |
| 0.9652777777777778 | 0 |
| 0.9659722222222222 | 0 |
| 0.9666666666666667 | 0 |
| 0.967361111111111 | 0 |
| 0.9680555555555556 | 0 |
| 0.96875 | 0 |
| 0.9694444444444444 | 0 |
| 0.970138888888889 | 0 |
| 0.9708333333333333 | 0 |
| 0.9715277777777778 | 0 |
| 0.9722222222222222 | 0 |
| 0.9729166666666668 | 0 |
| 0.9736111111111111 | 0 |
| 0.9743055555555555 | 0 |
| 0.975 | 0 |
| 0.9756944444444445 | 0 |
| 0.9763888888888889 | 0 |
| 0.9770833333333333 | 0 |
| 0.9777777777777777 | 0 |
| 0.9784722222222223 | 0 |
| 0.9791666666666666 | 0 |
| 0.9798611111111111 | 0 |
| 0.9805555555555556 | 0 |
| 0.9812500000000001 | 0 |
| 0.9819444444444444 | 0 |
| 0.9826388888888888 | 0 |
| 0.9833333333333334 | 0 |
| 0.9840277777777778 | 0 |
| 0.9847222222222222 | 0 |
| 0.9854166666666666 | 0 |
| 0.9861111111111112 | 0 |
| 0.9868055555555556 | 0 |
| 0.9874999999999999 | 0 |
| 0.9881944444444444 | 0 |
| 0.9888888888888889 | 0 |
| 0.9895833333333334 | 0 |
| 0.9902777777777777 | 0 |
| 0.9909722222222223 | 0 |
| 0.9916666666666667 | 0 |
| 0.9923611111111111 | 0 |
| 0.9930555555555555 | 0 |
| 0.99375 | 0 |
| 0.9944444444444445 | 0 |
| 0.9951388888888889 | 0 |
| 0.9958333333333332 | 0 |
| 0.9965277777777778 | 0 |
| 0.9972222222222222 | 0 |
| 0.9979166666666667 | 0 |
| 0.998611111111111 | 0 |
| 0.9993055555555556 | 0 |